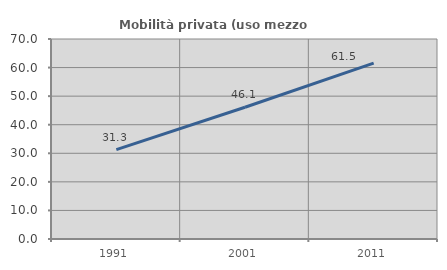
| Category | Mobilità privata (uso mezzo privato) |
|---|---|
| 1991.0 | 31.306 |
| 2001.0 | 46.105 |
| 2011.0 | 61.53 |